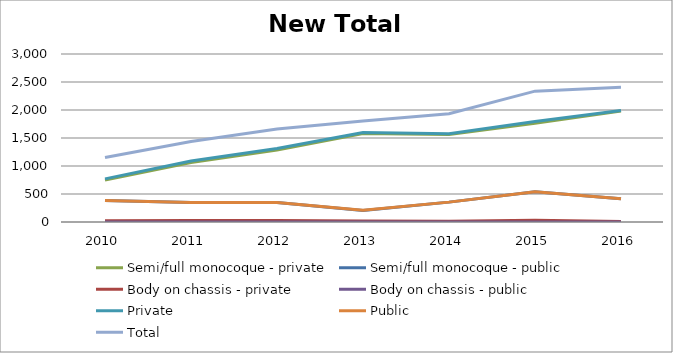
| Category | Semi/full monocoque - private | Semi/full monocoque - public | Body on chassis - private | Body on chassis - public | Private | Public | Total |
|---|---|---|---|---|---|---|---|
| 2010.0 | 748 | 383 | 22 | 0 | 770 | 383 | 1153 |
| 2011.0 | 1062 | 347 | 28 | 2 | 1090 | 349 | 1439 |
| 2012.0 | 1284 | 348 | 27 | 0 | 1311 | 348 | 1659 |
| 2013.0 | 1579 | 207 | 18 | 1 | 1597 | 208 | 1805 |
| 2014.0 | 1563 | 355 | 15 | 0 | 1578 | 355 | 1933 |
| 2015.0 | 1765 | 542 | 30 | 0 | 1795 | 542 | 2337 |
| 2016.0 | 1983 | 417 | 7 | 0 | 1990 | 417 | 2407 |